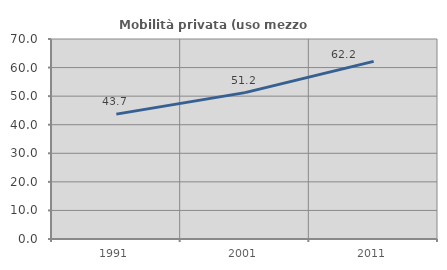
| Category | Mobilità privata (uso mezzo privato) |
|---|---|
| 1991.0 | 43.713 |
| 2001.0 | 51.226 |
| 2011.0 | 62.178 |